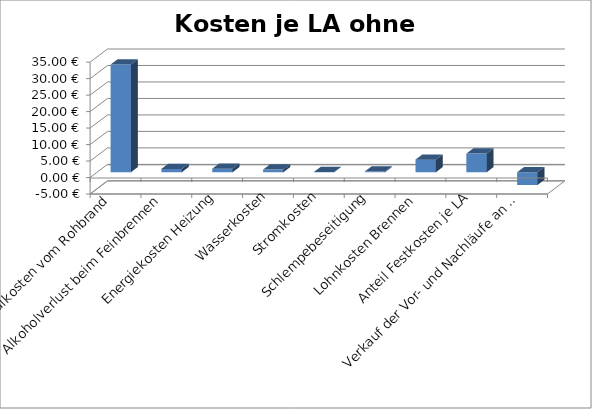
| Category | Kosten je LA ohne Vermarktung |
|---|---|
| Materialkosten vom Rohbrand | 32.677 |
| Alkoholverlust beim Feinbrennen | 1.015 |
| Energiekosten Heizung | 1.071 |
| Wasserkosten | 0.803 |
| Stromkosten | 0.076 |
| Schlempebeseitigung | 0.204 |
| Lohnkosten Brennen | 3.825 |
| Anteil Festkosten je LA | 5.657 |
| Verkauf der Vor- und Nachläufe an Händler pro LA | -3.872 |